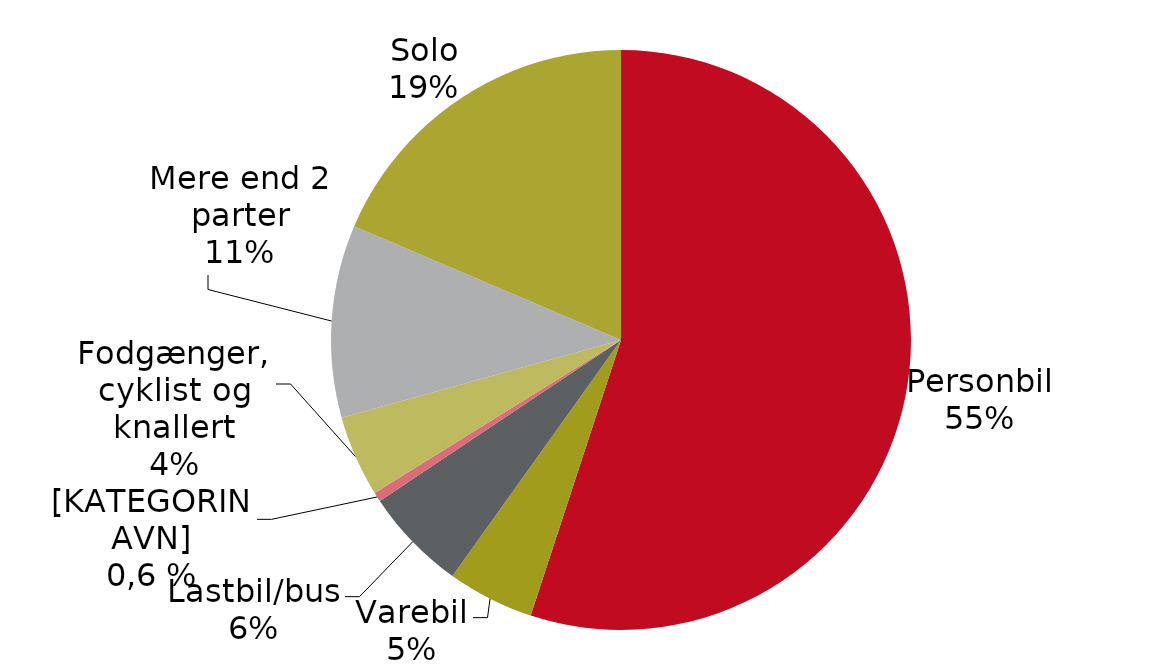
| Category |  Serie1 |
|---|---|
| Personbil | 0.55 |
| Varebil | 0.048 |
| Lastbil/bus | 0.058 |
| Motorcykel | 0.005 |
| Fodgænger, cyklist og knallert | 0.045 |
| Mere end 2 parter | 0.107 |
| Solo | 0.186 |